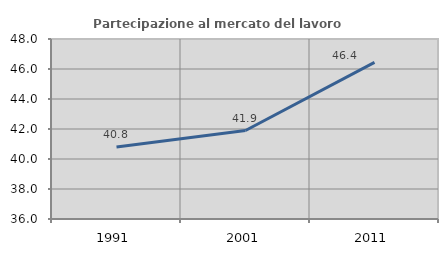
| Category | Partecipazione al mercato del lavoro  femminile |
|---|---|
| 1991.0 | 40.793 |
| 2001.0 | 41.897 |
| 2011.0 | 46.438 |